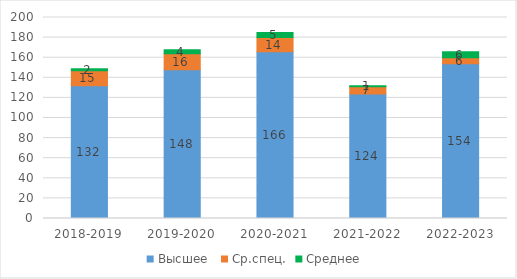
| Category | Высшее  | Ср.спец. | Среднее  |
|---|---|---|---|
| 2018-2019 | 132 | 15 | 2 |
| 2019-2020 | 148 | 16 | 4 |
| 2020-2021 | 166 | 14 | 5 |
| 2021-2022 | 124 | 7 | 1 |
| 2022-2023 | 154 | 6 | 6 |